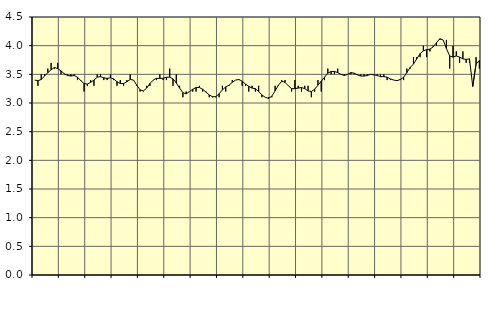
| Category | Piggar | Personliga och kulturella tjänster, SNI 90-98 |
|---|---|---|
| nan | 3.4 | 3.4 |
| 87.0 | 3.3 | 3.39 |
| 87.0 | 3.5 | 3.41 |
| 87.0 | 3.5 | 3.47 |
| nan | 3.6 | 3.53 |
| 88.0 | 3.7 | 3.58 |
| 88.0 | 3.6 | 3.62 |
| 88.0 | 3.7 | 3.6 |
| nan | 3.5 | 3.56 |
| 89.0 | 3.5 | 3.51 |
| 89.0 | 3.5 | 3.48 |
| 89.0 | 3.5 | 3.47 |
| nan | 3.5 | 3.48 |
| 90.0 | 3.4 | 3.45 |
| 90.0 | 3.4 | 3.39 |
| 90.0 | 3.2 | 3.34 |
| nan | 3.3 | 3.33 |
| 91.0 | 3.4 | 3.36 |
| 91.0 | 3.3 | 3.4 |
| 91.0 | 3.5 | 3.45 |
| nan | 3.5 | 3.46 |
| 92.0 | 3.4 | 3.44 |
| 92.0 | 3.4 | 3.43 |
| 92.0 | 3.5 | 3.44 |
| nan | 3.4 | 3.42 |
| 93.0 | 3.3 | 3.37 |
| 93.0 | 3.4 | 3.34 |
| 93.0 | 3.3 | 3.34 |
| nan | 3.4 | 3.37 |
| 94.0 | 3.5 | 3.41 |
| 94.0 | 3.4 | 3.4 |
| 94.0 | 3.3 | 3.31 |
| nan | 3.2 | 3.23 |
| 95.0 | 3.2 | 3.21 |
| 95.0 | 3.3 | 3.26 |
| 95.0 | 3.3 | 3.34 |
| nan | 3.4 | 3.4 |
| 96.0 | 3.4 | 3.43 |
| 96.0 | 3.5 | 3.43 |
| 96.0 | 3.4 | 3.43 |
| nan | 3.4 | 3.45 |
| 97.0 | 3.6 | 3.45 |
| 97.0 | 3.3 | 3.42 |
| 97.0 | 3.5 | 3.35 |
| nan | 3.3 | 3.26 |
| 98.0 | 3.1 | 3.18 |
| 98.0 | 3.2 | 3.16 |
| 98.0 | 3.2 | 3.2 |
| nan | 3.2 | 3.24 |
| 99.0 | 3.2 | 3.27 |
| 99.0 | 3.3 | 3.27 |
| 99.0 | 3.2 | 3.24 |
| nan | 3.2 | 3.19 |
| 0.0 | 3.1 | 3.14 |
| 0.0 | 3.1 | 3.11 |
| 0.0 | 3.1 | 3.11 |
| nan | 3.1 | 3.16 |
| 1.0 | 3.3 | 3.23 |
| 1.0 | 3.2 | 3.28 |
| 1.0 | 3.3 | 3.31 |
| nan | 3.4 | 3.36 |
| 2.0 | 3.4 | 3.4 |
| 2.0 | 3.4 | 3.41 |
| 2.0 | 3.3 | 3.38 |
| nan | 3.3 | 3.33 |
| 3.0 | 3.2 | 3.29 |
| 3.0 | 3.3 | 3.26 |
| 3.0 | 3.2 | 3.25 |
| nan | 3.3 | 3.2 |
| 4.0 | 3.1 | 3.14 |
| 4.0 | 3.1 | 3.1 |
| 4.0 | 3.1 | 3.08 |
| nan | 3.1 | 3.12 |
| 5.0 | 3.3 | 3.21 |
| 5.0 | 3.3 | 3.31 |
| 5.0 | 3.4 | 3.38 |
| nan | 3.4 | 3.36 |
| 6.0 | 3.3 | 3.3 |
| 6.0 | 3.2 | 3.25 |
| 6.0 | 3.4 | 3.25 |
| nan | 3.3 | 3.26 |
| 7.0 | 3.2 | 3.27 |
| 7.0 | 3.3 | 3.25 |
| 7.0 | 3.3 | 3.21 |
| nan | 3.1 | 3.2 |
| 8.0 | 3.2 | 3.24 |
| 8.0 | 3.4 | 3.31 |
| 8.0 | 3.2 | 3.38 |
| nan | 3.4 | 3.45 |
| 9.0 | 3.6 | 3.52 |
| 9.0 | 3.5 | 3.55 |
| 9.0 | 3.5 | 3.55 |
| nan | 3.6 | 3.53 |
| 10.0 | 3.5 | 3.5 |
| 10.0 | 3.5 | 3.48 |
| 10.0 | 3.5 | 3.5 |
| nan | 3.5 | 3.53 |
| 11.0 | 3.5 | 3.52 |
| 11.0 | 3.5 | 3.49 |
| 11.0 | 3.5 | 3.47 |
| nan | 3.5 | 3.47 |
| 12.0 | 3.5 | 3.48 |
| 12.0 | 3.5 | 3.5 |
| 12.0 | 3.5 | 3.49 |
| nan | 3.5 | 3.48 |
| 13.0 | 3.5 | 3.46 |
| 13.0 | 3.5 | 3.46 |
| 13.0 | 3.4 | 3.45 |
| nan | 3.4 | 3.42 |
| 14.0 | 3.4 | 3.4 |
| 14.0 | 3.4 | 3.39 |
| 14.0 | 3.4 | 3.41 |
| nan | 3.4 | 3.45 |
| 15.0 | 3.6 | 3.53 |
| 15.0 | 3.6 | 3.62 |
| 15.0 | 3.8 | 3.68 |
| nan | 3.8 | 3.77 |
| 16.0 | 3.8 | 3.86 |
| 16.0 | 4 | 3.91 |
| 16.0 | 3.8 | 3.93 |
| nan | 3.9 | 3.94 |
| 17.0 | 4 | 3.98 |
| 17.0 | 4 | 4.05 |
| 17.0 | 4.1 | 4.12 |
| nan | 4.1 | 4.1 |
| 18.0 | 4.1 | 3.95 |
| 18.0 | 3.6 | 3.82 |
| 18.0 | 4 | 3.8 |
| nan | 3.9 | 3.82 |
| 19.0 | 3.7 | 3.8 |
| 19.0 | 3.9 | 3.77 |
| 19.0 | 3.7 | 3.76 |
| nan | 3.7 | 3.77 |
| 20.0 | 3.3 | 3.29 |
| 20.0 | 3.8 | 3.68 |
| 20.0 | 3.6 | 3.74 |